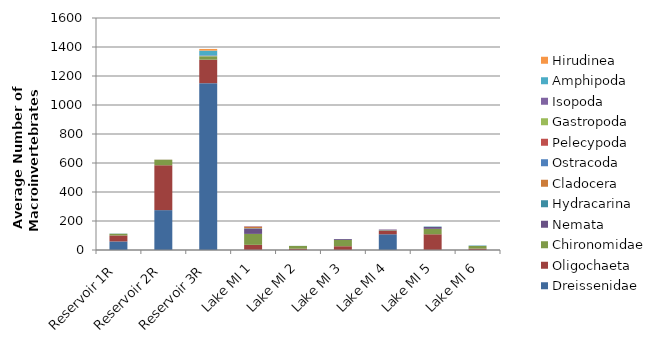
| Category | Dreissenidae | Oligochaeta | Chironomidae | Nemata | Hydracarina | Cladocera | Ostracoda | Pelecypoda | Gastropoda | Isopoda | Amphipoda | Hirudinea |
|---|---|---|---|---|---|---|---|---|---|---|---|---|
| Reservoir 1R | 59 | 41.5 | 11.5 | 0 | 1 | 0 | 0 | 0 | 0 | 0 | 0.5 | 0 |
| Reservoir 2R | 275 | 309.5 | 37.5 | 0 | 0.5 | 0 | 0 | 0 | 0 | 0 | 0.5 | 1 |
| Reservoir 3R | 1150.5 | 162 | 23 | 0.5 | 0 | 0 | 0 | 0 | 2 | 3.5 | 33.5 | 11.5 |
| Lake MI 1 | 0.5 | 35 | 75.5 | 37 | 2 | 8.5 | 2 | 3 | 0 | 0 | 0 | 0 |
| Lake MI 2 | 0 | 9 | 19 | 0 | 0.5 | 0 | 0 | 0 | 0 | 0 | 0 | 0 |
| Lake MI 3 | 0 | 26 | 43.5 | 6 | 0.5 | 0 | 0 | 0 | 0 | 0 | 0 | 0 |
| Lake MI 4 | 108.5 | 23.5 | 3.5 | 3 | 0 | 0.5 | 0 | 0 | 0 | 3 | 0 | 0 |
| Lake MI 5 | 0.5 | 108 | 37.5 | 12.5 | 3 | 0 | 0 | 0 | 0 | 0 | 0 | 0 |
| Lake MI 6 | 0 | 9.5 | 18 | 0 | 3 | 0 | 0 | 0 | 0 | 0 | 0 | 0 |